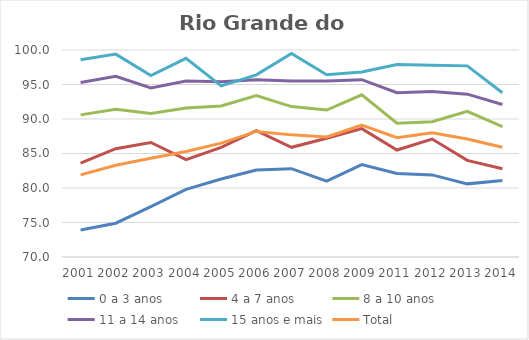
| Category | 0 a 3 anos | 4 a 7 anos | 8 a 10 anos | 11 a 14 anos | 15 anos e mais | Total |
|---|---|---|---|---|---|---|
| 2001.0 | 73.9 | 83.6 | 90.6 | 95.3 | 98.6 | 81.9 |
| 2002.0 | 74.9 | 85.7 | 91.4 | 96.2 | 99.4 | 83.3 |
| 2003.0 | 77.3 | 86.6 | 90.8 | 94.5 | 96.3 | 84.3 |
| 2004.0 | 79.8 | 84.1 | 91.6 | 95.5 | 98.8 | 85.3 |
| 2005.0 | 81.3 | 85.9 | 91.9 | 95.4 | 94.8 | 86.5 |
| 2006.0 | 82.6 | 88.3 | 93.4 | 95.7 | 96.4 | 88.2 |
| 2007.0 | 82.8 | 85.9 | 91.8 | 95.5 | 99.5 | 87.7 |
| 2008.0 | 81 | 87.2 | 91.3 | 95.5 | 96.4 | 87.4 |
| 2009.0 | 83.4 | 88.6 | 93.5 | 95.7 | 96.8 | 89.1 |
| 2011.0 | 82.1 | 85.5 | 89.4 | 93.8 | 97.9 | 87.3 |
| 2012.0 | 81.9 | 87.1 | 89.6 | 94 | 97.8 | 88 |
| 2013.0 | 80.6 | 84 | 91.1 | 93.6 | 97.7 | 87.1 |
| 2014.0 | 81.1 | 82.8 | 88.9 | 92.1 | 93.8 | 85.9 |